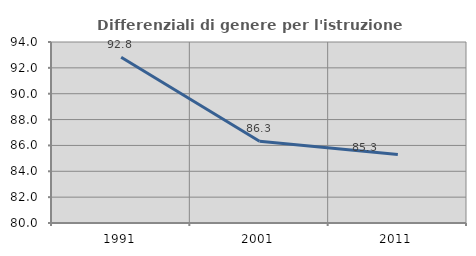
| Category | Differenziali di genere per l'istruzione superiore |
|---|---|
| 1991.0 | 92.818 |
| 2001.0 | 86.33 |
| 2011.0 | 85.303 |